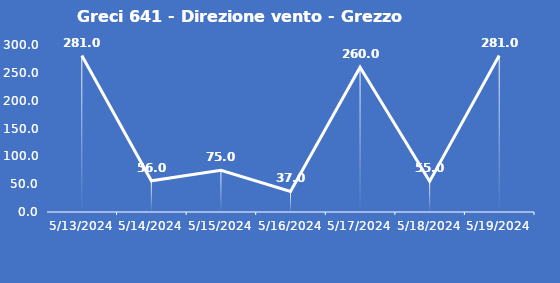
| Category | Greci 641 - Direzione vento - Grezzo (°N) |
|---|---|
| 5/13/24 | 281 |
| 5/14/24 | 56 |
| 5/15/24 | 75 |
| 5/16/24 | 37 |
| 5/17/24 | 260 |
| 5/18/24 | 55 |
| 5/19/24 | 281 |